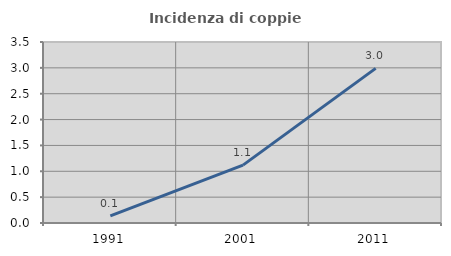
| Category | Incidenza di coppie miste |
|---|---|
| 1991.0 | 0.138 |
| 2001.0 | 1.12 |
| 2011.0 | 2.989 |